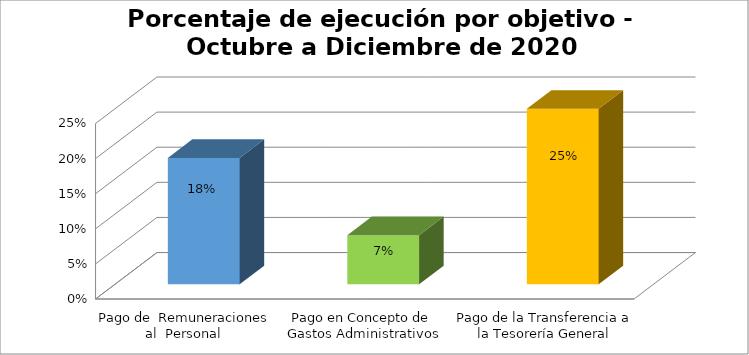
| Category | Series 0 |
|---|---|
| Pago de  Remuneraciones al  Personal  | 0.18 |
| Pago en Concepto de  Gastos Administrativos | 0.07 |
| Pago de la Transferencia a la Tesorería General | 0.25 |